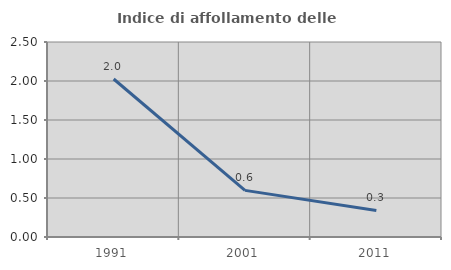
| Category | Indice di affollamento delle abitazioni  |
|---|---|
| 1991.0 | 2.026 |
| 2001.0 | 0.598 |
| 2011.0 | 0.341 |